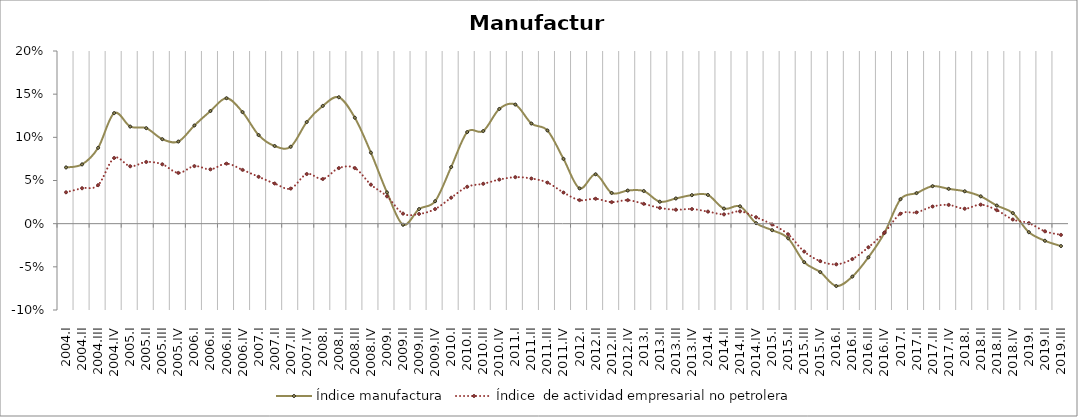
| Category | Índice manufactura | Índice  de actividad empresarial no petrolera |
|---|---|---|
| 2004.I | 0.065 | 0.036 |
| 2004.II | 0.069 | 0.041 |
| 2004.III | 0.088 | 0.045 |
| 2004.IV | 0.128 | 0.076 |
| 2005.I | 0.112 | 0.066 |
| 2005.II | 0.111 | 0.071 |
| 2005.III | 0.098 | 0.069 |
| 2005.IV | 0.095 | 0.059 |
| 2006.I | 0.114 | 0.067 |
| 2006.II | 0.13 | 0.063 |
| 2006.III | 0.145 | 0.07 |
| 2006.IV | 0.129 | 0.062 |
| 2007.I | 0.103 | 0.054 |
| 2007.II | 0.09 | 0.047 |
| 2007.III | 0.089 | 0.041 |
| 2007.IV | 0.118 | 0.057 |
| 2008.I | 0.136 | 0.052 |
| 2008.II | 0.146 | 0.064 |
| 2008.III | 0.123 | 0.064 |
| 2008.IV | 0.082 | 0.045 |
| 2009.I | 0.036 | 0.032 |
| 2009.II | -0.001 | 0.012 |
| 2009.III | 0.017 | 0.011 |
| 2009.IV | 0.026 | 0.017 |
| 2010.I | 0.066 | 0.03 |
| 2010.II | 0.106 | 0.043 |
| 2010.III | 0.107 | 0.046 |
| 2010.IV | 0.133 | 0.051 |
| 2011.I | 0.138 | 0.054 |
| 2011.II | 0.116 | 0.052 |
| 2011.III | 0.108 | 0.048 |
| 2011.IV | 0.075 | 0.036 |
| 2012.I | 0.041 | 0.027 |
| 2012.II | 0.057 | 0.029 |
| 2012.III | 0.036 | 0.025 |
| 2012.IV | 0.038 | 0.027 |
| 2013.I | 0.038 | 0.023 |
| 2013.II | 0.025 | 0.018 |
| 2013.III | 0.029 | 0.016 |
| 2013.IV | 0.033 | 0.017 |
| 2014.I | 0.033 | 0.014 |
| 2014.II | 0.017 | 0.011 |
| 2014.III | 0.02 | 0.014 |
| 2014.IV | 0.001 | 0.007 |
| 2015.I | -0.008 | -0.001 |
| 2015.II | -0.017 | -0.012 |
| 2015.III | -0.045 | -0.032 |
| 2015.IV | -0.056 | -0.043 |
| 2016.I | -0.072 | -0.047 |
| 2016.II | -0.061 | -0.041 |
| 2016.III | -0.039 | -0.027 |
| 2016.IV | -0.011 | -0.01 |
| 2017.I | 0.028 | 0.012 |
| 2017.II | 0.035 | 0.013 |
| 2017.III | 0.043 | 0.02 |
| 2017.IV | 0.04 | 0.022 |
| 2018.I | 0.038 | 0.017 |
| 2018.II | 0.032 | 0.022 |
| 2018.III | 0.021 | 0.016 |
| 2018.IV | 0.012 | 0.005 |
| 2019.I | -0.01 | 0.001 |
| 2019.II | -0.02 | -0.009 |
| 2019.III | -0.026 | -0.013 |